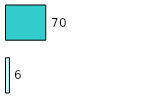
| Category | Series 0 | Series 1 |
|---|---|---|
| 0 | 6 | 70 |